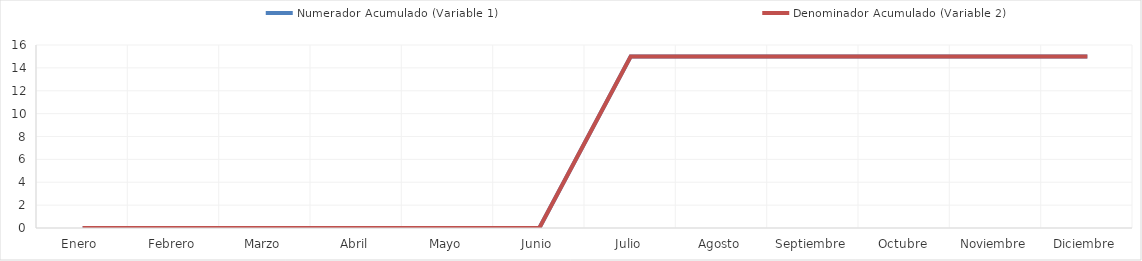
| Category | Numerador Acumulado (Variable 1) | Denominador Acumulado (Variable 2) |
|---|---|---|
| Enero  | 0 | 0 |
| Febrero | 0 | 0 |
| Marzo | 0 | 0 |
| Abril | 0 | 0 |
| Mayo | 0 | 0 |
| Junio | 0 | 0 |
| Julio | 15 | 15 |
| Agosto | 15 | 15 |
| Septiembre | 15 | 15 |
| Octubre | 15 | 15 |
| Noviembre | 15 | 15 |
| Diciembre | 15 | 15 |